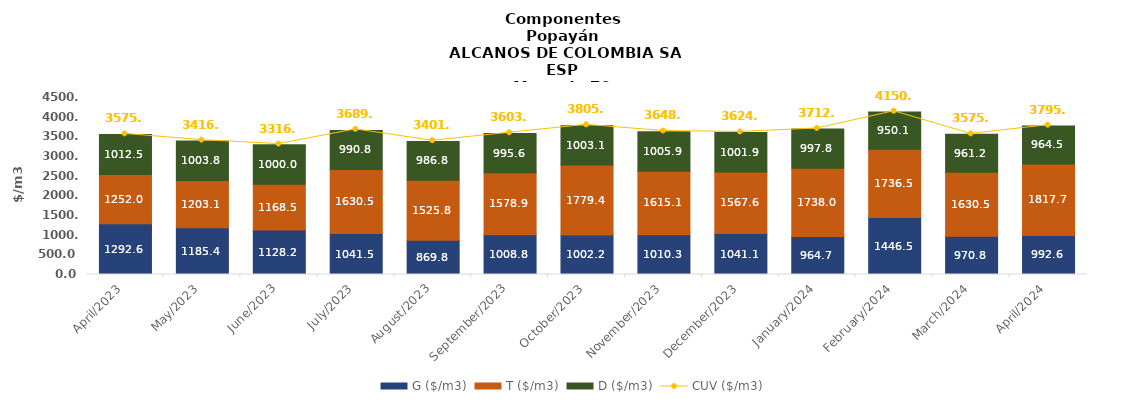
| Category | G ($/m3) | T ($/m3) | D ($/m3) |
|---|---|---|---|
| 2023-04-01 | 1292.6 | 1251.95 | 1012.48 |
| 2023-05-01 | 1185.42 | 1203.07 | 1003.78 |
| 2023-06-01 | 1128.21 | 1168.47 | 999.96 |
| 2023-07-01 | 1041.54 | 1630.51 | 990.77 |
| 2023-08-01 | 869.82 | 1525.81 | 986.78 |
| 2023-09-01 | 1008.82 | 1578.87 | 995.55 |
| 2023-10-01 | 1002.24 | 1779.41 | 1003.05 |
| 2023-11-01 | 1010.34 | 1615.11 | 1005.88 |
| 2023-12-01 | 1041.14 | 1567.6 | 1001.9 |
| 2024-01-01 | 964.66 | 1738.01 | 997.84 |
| 2024-02-01 | 1446.48 | 1736.48 | 950.05 |
| 2024-03-01 | 970.84 | 1630.52 | 961.16 |
| 2024-04-01 | 992.64 | 1817.67 | 964.49 |